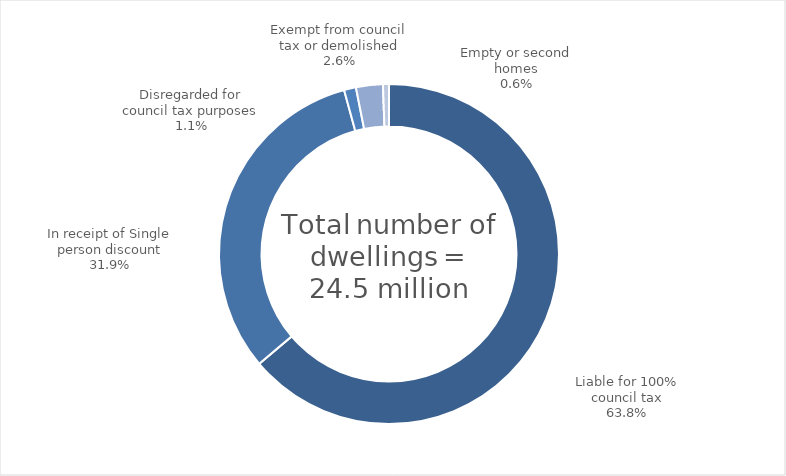
| Category | % of all dwellings |
|---|---|
| Liable for 100% council tax | 0.638 |
| In receipt of Single person discount | 0.319 |
| Disregarded for council tax purposes | 0.011 |
| Exempt from council tax or demolished | 0.026 |
| Empty or second homes | 0.006 |